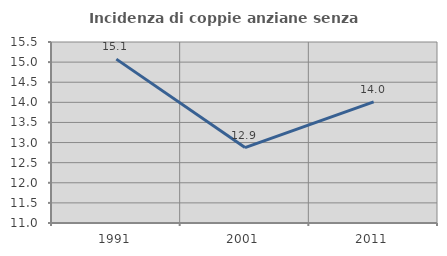
| Category | Incidenza di coppie anziane senza figli  |
|---|---|
| 1991.0 | 15.074 |
| 2001.0 | 12.875 |
| 2011.0 | 14.013 |